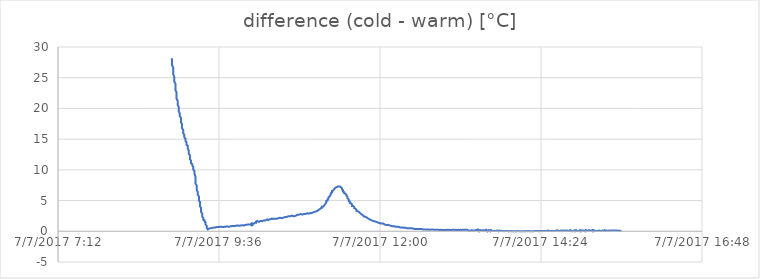
| Category | difference (cold - warm) [°C] |
|---|---|
| 42923.37013888889 | 28.06 |
| 42923.370833333334 | 28 |
| 42923.370833333334 | 27.75 |
| 42923.370833333334 | 27.37 |
| 42923.370833333334 | 27 |
| 42923.37152777778 | 26.69 |
| 42923.37152777778 | 26.31 |
| 42923.37152777778 | 25.94 |
| 42923.37152777778 | 25.56 |
| 42923.37222222222 | 25.19 |
| 42923.37222222222 | 24.81 |
| 42923.37222222222 | 24.37 |
| 42923.37291666667 | 24.06 |
| 42923.37291666667 | 23.69 |
| 42923.37291666667 | 23.38 |
| 42923.37291666667 | 23 |
| 42923.373611111114 | 22.62 |
| 42923.373611111114 | 22.31 |
| 42923.373611111114 | 21.94 |
| 42923.373611111114 | 21.62 |
| 42923.37430555555 | 21.25 |
| 42923.37430555555 | 21 |
| 42923.37430555555 | 20.75 |
| 42923.37430555555 | 20.56 |
| 42923.375 | 20.25 |
| 42923.375 | 19.87 |
| 42923.375 | 19.75 |
| 42923.375 | 19.5 |
| 42923.37569444445 | 19.19 |
| 42923.37569444445 | 18.94 |
| 42923.37569444445 | 18.75 |
| 42923.376388888886 | 18.44 |
| 42923.376388888886 | 18.12 |
| 42923.376388888886 | 17.87 |
| 42923.376388888886 | 17.69 |
| 42923.37708333333 | 17.44 |
| 42923.37708333333 | 17.19 |
| 42923.37708333333 | 16.94 |
| 42923.37708333333 | 16.75 |
| 42923.37777777778 | 16.5 |
| 42923.37777777778 | 16.25 |
| 42923.37777777778 | 16.12 |
| 42923.37777777778 | 15.94 |
| 42923.37847222222 | 15.75 |
| 42923.37847222222 | 15.56 |
| 42923.37847222222 | 15.31 |
| 42923.37847222222 | 15.25 |
| 42923.379166666666 | 15.06 |
| 42923.379166666666 | 14.94 |
| 42923.379166666666 | 14.75 |
| 42923.379166666666 | 14.63 |
| 42923.37986111111 | 14.44 |
| 42923.37986111111 | 14.25 |
| 42923.37986111111 | 14.06 |
| 42923.38055555556 | 13.94 |
| 42923.38055555556 | 13.69 |
| 42923.38055555556 | 13.5 |
| 42923.38055555556 | 13.38 |
| 42923.38125 | 13.13 |
| 42923.38125 | 12.94 |
| 42923.38125 | 12.81 |
| 42923.38125 | 12.56 |
| 42923.381944444445 | 12.37 |
| 42923.381944444445 | 12.13 |
| 42923.381944444445 | 11.94 |
| 42923.381944444445 | 11.69 |
| 42923.38263888889 | 11.5 |
| 42923.38263888889 | 11.38 |
| 42923.38263888889 | 11.25 |
| 42923.38263888889 | 11.06 |
| 42923.38333333333 | 10.94 |
| 42923.38333333333 | 10.88 |
| 42923.38333333333 | 10.75 |
| 42923.38333333333 | 10.69 |
| 42923.38402777778 | 10.5 |
| 42923.38402777778 | 10.25 |
| 42923.38402777778 | 10.06 |
| 42923.38402777778 | 9.94 |
| 42923.384722222225 | 9.81 |
| 42923.384722222225 | 9.63 |
| 42923.384722222225 | 9.44 |
| 42923.384722222225 | 9.31 |
| 42923.385416666664 | 8.81 |
| 42923.385416666664 | 8.31 |
| 42923.385416666664 | 8 |
| 42923.385416666664 | 7.75 |
| 42923.38611111111 | 7.44 |
| 42923.38611111111 | 7.19 |
| 42923.38611111111 | 6.94 |
| 42923.38611111111 | 6.69 |
| 42923.38680555556 | 6.44 |
| 42923.38680555556 | 6.19 |
| 42923.38680555556 | 5.94 |
| 42923.3875 | 5.69 |
| 42923.3875 | 5.5 |
| 42923.3875 | 5.25 |
| 42923.3875 | 5 |
| 42923.388194444444 | 4.75 |
| 42923.388194444444 | 4.5 |
| 42923.388194444444 | 4.31 |
| 42923.388194444444 | 4.06 |
| 42923.38888888889 | 3.81 |
| 42923.38888888889 | 3.62 |
| 42923.38888888889 | 3.37 |
| 42923.38888888889 | 3.12 |
| 42923.38958333333 | 2.94 |
| 42923.38958333333 | 2.69 |
| 42923.38958333333 | 2.56 |
| 42923.38958333333 | 2.37 |
| 42923.39027777778 | 2.19 |
| 42923.39027777778 | 2.06 |
| 42923.39027777778 | 2.06 |
| 42923.39027777778 | 1.87 |
| 42923.39097222222 | 1.81 |
| 42923.39097222222 | 1.62 |
| 42923.39097222222 | 1.5 |
| 42923.39166666667 | 1.44 |
| 42923.39166666667 | 1.31 |
| 42923.39166666667 | 1.12 |
| 42923.39166666667 | 1 |
| 42923.39236111111 | 0.88 |
| 42923.39236111111 | 0.75 |
| 42923.39236111111 | 0.56 |
| 42923.39236111111 | 0.44 |
| 42923.393055555556 | 0.31 |
| 42923.393055555556 | 0.19 |
| 42923.393055555556 | 0.19 |
| 42923.393055555556 | 0.25 |
| 42923.39375 | 0.44 |
| 42923.39375 | 0.5 |
| 42923.39375 | 0.44 |
| 42923.39375 | 0.5 |
| 42923.39444444444 | 0.5 |
| 42923.39444444444 | 0.5 |
| 42923.39444444444 | 0.5 |
| 42923.39444444444 | 0.5 |
| 42923.39513888889 | 0.5 |
| 42923.39513888889 | 0.56 |
| 42923.39513888889 | 0.62 |
| 42923.39513888889 | 0.62 |
| 42923.395833333336 | 0.56 |
| 42923.395833333336 | 0.62 |
| 42923.395833333336 | 0.56 |
| 42923.396527777775 | 0.56 |
| 42923.396527777775 | 0.56 |
| 42923.396527777775 | 0.62 |
| 42923.396527777775 | 0.62 |
| 42923.39722222222 | 0.62 |
| 42923.39722222222 | 0.62 |
| 42923.39722222222 | 0.62 |
| 42923.39722222222 | 0.62 |
| 42923.39791666667 | 0.62 |
| 42923.39791666667 | 0.62 |
| 42923.39791666667 | 0.62 |
| 42923.39791666667 | 0.69 |
| 42923.39861111111 | 0.69 |
| 42923.39861111111 | 0.69 |
| 42923.39861111111 | 0.69 |
| 42923.39861111111 | 0.69 |
| 42923.399305555555 | 0.69 |
| 42923.399305555555 | 0.69 |
| 42923.399305555555 | 0.69 |
| 42923.399305555555 | 0.69 |
| 42923.4 | 0.69 |
| 42923.4 | 0.69 |
| 42923.4 | 0.75 |
| 42923.4 | 0.69 |
| 42923.40069444444 | 0.75 |
| 42923.40069444444 | 0.75 |
| 42923.40069444444 | 0.75 |
| 42923.40069444444 | 0.75 |
| 42923.40138888889 | 0.75 |
| 42923.40138888889 | 0.75 |
| 42923.40138888889 | 0.75 |
| 42923.402083333334 | 0.69 |
| 42923.402083333334 | 0.69 |
| 42923.402083333334 | 0.69 |
| 42923.402083333334 | 0.69 |
| 42923.40277777778 | 0.69 |
| 42923.40277777778 | 0.75 |
| 42923.40277777778 | 0.75 |
| 42923.40277777778 | 0.75 |
| 42923.40347222222 | 0.75 |
| 42923.40347222222 | 0.75 |
| 42923.40347222222 | 0.75 |
| 42923.40347222222 | 0.75 |
| 42923.40416666667 | 0.75 |
| 42923.40416666667 | 0.75 |
| 42923.40416666667 | 0.69 |
| 42923.40416666667 | 0.75 |
| 42923.404861111114 | 0.81 |
| 42923.404861111114 | 0.75 |
| 42923.404861111114 | 0.75 |
| 42923.404861111114 | 0.75 |
| 42923.40555555555 | 0.75 |
| 42923.40555555555 | 0.81 |
| 42923.40555555555 | 0.81 |
| 42923.40625 | 0.75 |
| 42923.40625 | 0.75 |
| 42923.40625 | 0.81 |
| 42923.40625 | 0.81 |
| 42923.40694444445 | 0.81 |
| 42923.40694444445 | 0.81 |
| 42923.40694444445 | 0.81 |
| 42923.40694444445 | 0.81 |
| 42923.407638888886 | 0.81 |
| 42923.407638888886 | 0.88 |
| 42923.407638888886 | 0.88 |
| 42923.407638888886 | 0.88 |
| 42923.40833333333 | 0.88 |
| 42923.40833333333 | 0.81 |
| 42923.40833333333 | 0.88 |
| 42923.40833333333 | 0.88 |
| 42923.40902777778 | 0.88 |
| 42923.40902777778 | 0.81 |
| 42923.40902777778 | 0.88 |
| 42923.40902777778 | 0.88 |
| 42923.40972222222 | 0.88 |
| 42923.40972222222 | 0.88 |
| 42923.40972222222 | 0.88 |
| 42923.410416666666 | 0.88 |
| 42923.410416666666 | 0.88 |
| 42923.410416666666 | 0.88 |
| 42923.410416666666 | 0.94 |
| 42923.41111111111 | 0.94 |
| 42923.41111111111 | 0.94 |
| 42923.41111111111 | 0.94 |
| 42923.41180555556 | 0.94 |
| 42923.41180555556 | 0.88 |
| 42923.41180555556 | 0.88 |
| 42923.41180555556 | 0.88 |
| 42923.4125 | 0.88 |
| 42923.4125 | 0.94 |
| 42923.4125 | 0.94 |
| 42923.4125 | 1 |
| 42923.413194444445 | 0.94 |
| 42923.413194444445 | 0.94 |
| 42923.413194444445 | 0.94 |
| 42923.413194444445 | 0.94 |
| 42923.41388888889 | 0.94 |
| 42923.41388888889 | 1 |
| 42923.41388888889 | 1 |
| 42923.41388888889 | 1 |
| 42923.41458333333 | 1 |
| 42923.41458333333 | 0.94 |
| 42923.41458333333 | 0.94 |
| 42923.41458333333 | 1 |
| 42923.41527777778 | 0.94 |
| 42923.41527777778 | 1 |
| 42923.41527777778 | 1.06 |
| 42923.41527777778 | 1 |
| 42923.415972222225 | 1 |
| 42923.415972222225 | 1 |
| 42923.415972222225 | 1.06 |
| 42923.415972222225 | 1.06 |
| 42923.416666666664 | 1.06 |
| 42923.416666666664 | 1.06 |
| 42923.416666666664 | 1.06 |
| 42923.41736111111 | 1.06 |
| 42923.41736111111 | 1.06 |
| 42923.41736111111 | 1.12 |
| 42923.41736111111 | 1.06 |
| 42923.41805555556 | 1.12 |
| 42923.41805555556 | 1.06 |
| 42923.41805555556 | 1.12 |
| 42923.41805555556 | 1.12 |
| 42923.41875 | 1.12 |
| 42923.41875 | 1.12 |
| 42923.41875 | 1.19 |
| 42923.41875 | 1.12 |
| 42923.419444444444 | 1.12 |
| 42923.419444444444 | 1.19 |
| 42923.419444444444 | 1.19 |
| 42923.419444444444 | 1.19 |
| 42923.42013888889 | 1.25 |
| 42923.42013888889 | 1.25 |
| 42923.42013888889 | 1 |
| 42923.42083333333 | 1 |
| 42923.42083333333 | 1.06 |
| 42923.42083333333 | 1.12 |
| 42923.42083333333 | 1.19 |
| 42923.42152777778 | 1.25 |
| 42923.42152777778 | 1.25 |
| 42923.42152777778 | 1.31 |
| 42923.42152777778 | 1.31 |
| 42923.42222222222 | 1.37 |
| 42923.42222222222 | 1.37 |
| 42923.42222222222 | 1.37 |
| 42923.42222222222 | 1.37 |
| 42923.42291666667 | 1.37 |
| 42923.42291666667 | 1.37 |
| 42923.42291666667 | 1.37 |
| 42923.42291666667 | 1.56 |
| 42923.42361111111 | 1.69 |
| 42923.42361111111 | 1.62 |
| 42923.42361111111 | 1.69 |
| 42923.42361111111 | 1.62 |
| 42923.424305555556 | 1.56 |
| 42923.424305555556 | 1.56 |
| 42923.424305555556 | 1.56 |
| 42923.424305555556 | 1.56 |
| 42923.425 | 1.56 |
| 42923.425 | 1.62 |
| 42923.425 | 1.62 |
| 42923.425 | 1.62 |
| 42923.42569444444 | 1.69 |
| 42923.42569444444 | 1.69 |
| 42923.42569444444 | 1.69 |
| 42923.42569444444 | 1.69 |
| 42923.42638888889 | 1.69 |
| 42923.42638888889 | 1.69 |
| 42923.42638888889 | 1.69 |
| 42923.42638888889 | 1.69 |
| 42923.427083333336 | 1.69 |
| 42923.427083333336 | 1.69 |
| 42923.427083333336 | 1.69 |
| 42923.427083333336 | 1.69 |
| 42923.427777777775 | 1.75 |
| 42923.427777777775 | 1.75 |
| 42923.427777777775 | 1.81 |
| 42923.42847222222 | 1.75 |
| 42923.42847222222 | 1.75 |
| 42923.42847222222 | 1.75 |
| 42923.42847222222 | 1.81 |
| 42923.42916666667 | 1.81 |
| 42923.42916666667 | 1.81 |
| 42923.42916666667 | 1.87 |
| 42923.42916666667 | 1.87 |
| 42923.42986111111 | 1.94 |
| 42923.42986111111 | 1.87 |
| 42923.42986111111 | 1.87 |
| 42923.42986111111 | 1.94 |
| 42923.430555555555 | 1.81 |
| 42923.430555555555 | 1.87 |
| 42923.430555555555 | 1.87 |
| 42923.430555555555 | 1.94 |
| 42923.43125 | 1.94 |
| 42923.43125 | 1.94 |
| 42923.43125 | 1.94 |
| 42923.43125 | 2 |
| 42923.43194444444 | 1.94 |
| 42923.43194444444 | 1.94 |
| 42923.43194444444 | 1.94 |
| 42923.43194444444 | 2 |
| 42923.43263888889 | 2.06 |
| 42923.43263888889 | 2.06 |
| 42923.43263888889 | 2 |
| 42923.43263888889 | 2.06 |
| 42923.433333333334 | 2 |
| 42923.433333333334 | 2 |
| 42923.433333333334 | 2.06 |
| 42923.43402777778 | 2.06 |
| 42923.43402777778 | 2 |
| 42923.43402777778 | 2.06 |
| 42923.43402777778 | 2.06 |
| 42923.43472222222 | 2.06 |
| 42923.43472222222 | 2.12 |
| 42923.43472222222 | 2.06 |
| 42923.43472222222 | 2.06 |
| 42923.43541666667 | 2.06 |
| 42923.43541666667 | 2.12 |
| 42923.43541666667 | 2.06 |
| 42923.43541666667 | 2.12 |
| 42923.436111111114 | 2.06 |
| 42923.436111111114 | 2.12 |
| 42923.436111111114 | 2.12 |
| 42923.436111111114 | 2.12 |
| 42923.43680555555 | 2.12 |
| 42923.43680555555 | 2.19 |
| 42923.43680555555 | 2.12 |
| 42923.43680555555 | 2.19 |
| 42923.4375 | 2.19 |
| 42923.4375 | 2.12 |
| 42923.4375 | 2.19 |
| 42923.4375 | 2.12 |
| 42923.43819444445 | 2.19 |
| 42923.43819444445 | 2.19 |
| 42923.43819444445 | 2.25 |
| 42923.43819444445 | 2.12 |
| 42923.438888888886 | 2.12 |
| 42923.438888888886 | 2.06 |
| 42923.438888888886 | 2.12 |
| 42923.43958333333 | 2.19 |
| 42923.43958333333 | 2.25 |
| 42923.43958333333 | 2.25 |
| 42923.43958333333 | 2.25 |
| 42923.44027777778 | 2.25 |
| 42923.44027777778 | 2.25 |
| 42923.44027777778 | 2.25 |
| 42923.44027777778 | 2.25 |
| 42923.44097222222 | 2.31 |
| 42923.44097222222 | 2.31 |
| 42923.44097222222 | 2.31 |
| 42923.44097222222 | 2.31 |
| 42923.441666666666 | 2.31 |
| 42923.441666666666 | 2.37 |
| 42923.441666666666 | 2.37 |
| 42923.441666666666 | 2.37 |
| 42923.44236111111 | 2.37 |
| 42923.44236111111 | 2.44 |
| 42923.44236111111 | 2.44 |
| 42923.44236111111 | 2.44 |
| 42923.44305555556 | 2.44 |
| 42923.44305555556 | 2.44 |
| 42923.44305555556 | 2.44 |
| 42923.44375 | 2.44 |
| 42923.44375 | 2.5 |
| 42923.44375 | 2.44 |
| 42923.44375 | 2.5 |
| 42923.444444444445 | 2.44 |
| 42923.444444444445 | 2.5 |
| 42923.444444444445 | 2.5 |
| 42923.444444444445 | 2.5 |
| 42923.44513888889 | 2.56 |
| 42923.44513888889 | 2.62 |
| 42923.44513888889 | 2.62 |
| 42923.44513888889 | 2.56 |
| 42923.44583333333 | 2.5 |
| 42923.44583333333 | 2.5 |
| 42923.44583333333 | 2.56 |
| 42923.44583333333 | 2.44 |
| 42923.44652777778 | 2.44 |
| 42923.44652777778 | 2.44 |
| 42923.44652777778 | 2.5 |
| 42923.44652777778 | 2.44 |
| 42923.447222222225 | 2.5 |
| 42923.447222222225 | 2.5 |
| 42923.447222222225 | 2.56 |
| 42923.447916666664 | 2.56 |
| 42923.447916666664 | 2.56 |
| 42923.447916666664 | 2.56 |
| 42923.447916666664 | 2.62 |
| 42923.44861111111 | 2.69 |
| 42923.44861111111 | 2.62 |
| 42923.44861111111 | 2.69 |
| 42923.44861111111 | 2.69 |
| 42923.44930555556 | 2.69 |
| 42923.44930555556 | 2.69 |
| 42923.44930555556 | 2.69 |
| 42923.44930555556 | 2.69 |
| 42923.45 | 2.75 |
| 42923.45 | 2.81 |
| 42923.45 | 2.75 |
| 42923.45 | 2.75 |
| 42923.450694444444 | 2.81 |
| 42923.450694444444 | 2.75 |
| 42923.450694444444 | 2.75 |
| 42923.450694444444 | 2.81 |
| 42923.45138888889 | 2.75 |
| 42923.45138888889 | 2.81 |
| 42923.45138888889 | 2.75 |
| 42923.45138888889 | 2.75 |
| 42923.45208333333 | 2.75 |
| 42923.45208333333 | 2.69 |
| 42923.45208333333 | 2.75 |
| 42923.45208333333 | 2.75 |
| 42923.45277777778 | 2.81 |
| 42923.45277777778 | 2.75 |
| 42923.45277777778 | 2.81 |
| 42923.45347222222 | 2.81 |
| 42923.45347222222 | 2.87 |
| 42923.45347222222 | 2.87 |
| 42923.45347222222 | 2.81 |
| 42923.45416666667 | 2.87 |
| 42923.45416666667 | 2.87 |
| 42923.45416666667 | 2.87 |
| 42923.45416666667 | 2.87 |
| 42923.45486111111 | 2.94 |
| 42923.45486111111 | 2.87 |
| 42923.45486111111 | 2.87 |
| 42923.45486111111 | 2.87 |
| 42923.455555555556 | 2.87 |
| 42923.455555555556 | 2.87 |
| 42923.455555555556 | 2.87 |
| 42923.455555555556 | 2.94 |
| 42923.45625 | 2.94 |
| 42923.45625 | 3 |
| 42923.45625 | 2.94 |
| 42923.45625 | 2.94 |
| 42923.45694444444 | 2.94 |
| 42923.45694444444 | 3 |
| 42923.45694444444 | 3.06 |
| 42923.45694444444 | 3.06 |
| 42923.45763888889 | 3 |
| 42923.45763888889 | 3.06 |
| 42923.45763888889 | 3.06 |
| 42923.45763888889 | 3.06 |
| 42923.458333333336 | 3.06 |
| 42923.458333333336 | 3.06 |
| 42923.458333333336 | 3.06 |
| 42923.458333333336 | 3.06 |
| 42923.459027777775 | 3.12 |
| 42923.459027777775 | 3.12 |
| 42923.459027777775 | 3.12 |
| 42923.459027777775 | 3.19 |
| 42923.45972222222 | 3.19 |
| 42923.45972222222 | 3.19 |
| 42923.45972222222 | 3.25 |
| 42923.46041666667 | 3.25 |
| 42923.46041666667 | 3.25 |
| 42923.46041666667 | 3.25 |
| 42923.46041666667 | 3.31 |
| 42923.46111111111 | 3.31 |
| 42923.46111111111 | 3.31 |
| 42923.46111111111 | 3.37 |
| 42923.46111111111 | 3.44 |
| 42923.461805555555 | 3.5 |
| 42923.461805555555 | 3.5 |
| 42923.461805555555 | 3.5 |
| 42923.461805555555 | 3.56 |
| 42923.4625 | 3.56 |
| 42923.4625 | 3.62 |
| 42923.4625 | 3.69 |
| 42923.4625 | 3.69 |
| 42923.46319444444 | 3.75 |
| 42923.46319444444 | 3.75 |
| 42923.46319444444 | 3.81 |
| 42923.46319444444 | 3.81 |
| 42923.46388888889 | 3.81 |
| 42923.46388888889 | 3.94 |
| 42923.46388888889 | 3.94 |
| 42923.46388888889 | 4 |
| 42923.464583333334 | 4 |
| 42923.464583333334 | 4.06 |
| 42923.464583333334 | 4.12 |
| 42923.46527777778 | 4.19 |
| 42923.46527777778 | 4.19 |
| 42923.46527777778 | 4.31 |
| 42923.46527777778 | 4.31 |
| 42923.46597222222 | 4.44 |
| 42923.46597222222 | 4.44 |
| 42923.46597222222 | 4.56 |
| 42923.46597222222 | 4.56 |
| 42923.46666666667 | 4.69 |
| 42923.46666666667 | 4.75 |
| 42923.46666666667 | 4.81 |
| 42923.46666666667 | 4.94 |
| 42923.467361111114 | 5 |
| 42923.467361111114 | 5.12 |
| 42923.467361111114 | 5.19 |
| 42923.467361111114 | 5.25 |
| 42923.46805555555 | 5.31 |
| 42923.46805555555 | 5.44 |
| 42923.46805555555 | 5.56 |
| 42923.46805555555 | 5.56 |
| 42923.46875 | 5.69 |
| 42923.46875 | 5.75 |
| 42923.46875 | 5.81 |
| 42923.46944444445 | 6 |
| 42923.46944444445 | 6.12 |
| 42923.46944444445 | 6.19 |
| 42923.46944444445 | 6.19 |
| 42923.470138888886 | 6.31 |
| 42923.470138888886 | 6.37 |
| 42923.470138888886 | 6.37 |
| 42923.470138888886 | 6.56 |
| 42923.47083333333 | 6.62 |
| 42923.47083333333 | 6.62 |
| 42923.47083333333 | 6.75 |
| 42923.47083333333 | 6.75 |
| 42923.47152777778 | 6.87 |
| 42923.47152777778 | 6.87 |
| 42923.47152777778 | 6.94 |
| 42923.47152777778 | 7 |
| 42923.47222222222 | 7.06 |
| 42923.47222222222 | 7.06 |
| 42923.47222222222 | 7.12 |
| 42923.47222222222 | 7.12 |
| 42923.472916666666 | 7.19 |
| 42923.472916666666 | 7.19 |
| 42923.472916666666 | 7.19 |
| 42923.472916666666 | 7.25 |
| 42923.47361111111 | 7.25 |
| 42923.47361111111 | 7.31 |
| 42923.47361111111 | 7.25 |
| 42923.47361111111 | 7.31 |
| 42923.47430555556 | 7.31 |
| 42923.47430555556 | 7.37 |
| 42923.47430555556 | 7.31 |
| 42923.475 | 7.31 |
| 42923.475 | 7.31 |
| 42923.475 | 7.25 |
| 42923.475 | 7.25 |
| 42923.475694444445 | 7.19 |
| 42923.475694444445 | 7.19 |
| 42923.475694444445 | 7.19 |
| 42923.475694444445 | 7.06 |
| 42923.47638888889 | 7 |
| 42923.47638888889 | 6.94 |
| 42923.47638888889 | 6.87 |
| 42923.47638888889 | 6.81 |
| 42923.47708333333 | 6.69 |
| 42923.47708333333 | 6.69 |
| 42923.47708333333 | 6.56 |
| 42923.47708333333 | 6.44 |
| 42923.47777777778 | 6.37 |
| 42923.47777777778 | 6.31 |
| 42923.47777777778 | 6.25 |
| 42923.47777777778 | 6.19 |
| 42923.478472222225 | 6.12 |
| 42923.478472222225 | 6 |
| 42923.478472222225 | 6 |
| 42923.479166666664 | 5.94 |
| 42923.479166666664 | 5.75 |
| 42923.479166666664 | 5.69 |
| 42923.479166666664 | 5.62 |
| 42923.47986111111 | 5.56 |
| 42923.47986111111 | 5.44 |
| 42923.47986111111 | 5.37 |
| 42923.47986111111 | 5.31 |
| 42923.48055555556 | 5.19 |
| 42923.48055555556 | 5.12 |
| 42923.48055555556 | 5.06 |
| 42923.48055555556 | 4.94 |
| 42923.48125 | 4.87 |
| 42923.48125 | 4.81 |
| 42923.48125 | 4.75 |
| 42923.48125 | 4.62 |
| 42923.481944444444 | 4.56 |
| 42923.481944444444 | 4.5 |
| 42923.481944444444 | 4.5 |
| 42923.48263888889 | 4.37 |
| 42923.48263888889 | 4.25 |
| 42923.48263888889 | 4.25 |
| 42923.48263888889 | 4.12 |
| 42923.48333333333 | 4.12 |
| 42923.48333333333 | 4.06 |
| 42923.48333333333 | 4 |
| 42923.48333333333 | 4 |
| 42923.48402777778 | 3.94 |
| 42923.48402777778 | 3.87 |
| 42923.48402777778 | 3.75 |
| 42923.48402777778 | 3.69 |
| 42923.48472222222 | 3.69 |
| 42923.48472222222 | 3.62 |
| 42923.48472222222 | 3.56 |
| 42923.48472222222 | 3.56 |
| 42923.48541666667 | 3.5 |
| 42923.48541666667 | 3.44 |
| 42923.48541666667 | 3.37 |
| 42923.48541666667 | 3.31 |
| 42923.48611111111 | 3.25 |
| 42923.48611111111 | 3.25 |
| 42923.48611111111 | 3.19 |
| 42923.486805555556 | 3.19 |
| 42923.486805555556 | 3.12 |
| 42923.486805555556 | 3.06 |
| 42923.486805555556 | 3.06 |
| 42923.4875 | 3 |
| 42923.4875 | 2.94 |
| 42923.4875 | 2.87 |
| 42923.4875 | 2.87 |
| 42923.48819444444 | 2.81 |
| 42923.48819444444 | 2.81 |
| 42923.48819444444 | 2.81 |
| 42923.48819444444 | 2.75 |
| 42923.48888888889 | 2.69 |
| 42923.48888888889 | 2.62 |
| 42923.48888888889 | 2.69 |
| 42923.48888888889 | 2.62 |
| 42923.489583333336 | 2.56 |
| 42923.489583333336 | 2.5 |
| 42923.489583333336 | 2.5 |
| 42923.489583333336 | 2.5 |
| 42923.490277777775 | 2.37 |
| 42923.490277777775 | 2.44 |
| 42923.490277777775 | 2.37 |
| 42923.49097222222 | 2.37 |
| 42923.49097222222 | 2.31 |
| 42923.49097222222 | 2.25 |
| 42923.49097222222 | 2.31 |
| 42923.49166666667 | 2.25 |
| 42923.49166666667 | 2.25 |
| 42923.49166666667 | 2.19 |
| 42923.49166666667 | 2.19 |
| 42923.49236111111 | 2.12 |
| 42923.49236111111 | 2.12 |
| 42923.49236111111 | 2.06 |
| 42923.49236111111 | 2.06 |
| 42923.493055555555 | 2 |
| 42923.493055555555 | 2 |
| 42923.493055555555 | 2.06 |
| 42923.493055555555 | 1.94 |
| 42923.49375 | 1.94 |
| 42923.49375 | 1.87 |
| 42923.49375 | 1.94 |
| 42923.49375 | 1.81 |
| 42923.49444444444 | 1.81 |
| 42923.49444444444 | 1.87 |
| 42923.49444444444 | 1.81 |
| 42923.49513888889 | 1.75 |
| 42923.49513888889 | 1.75 |
| 42923.49513888889 | 1.75 |
| 42923.49513888889 | 1.69 |
| 42923.495833333334 | 1.69 |
| 42923.495833333334 | 1.69 |
| 42923.495833333334 | 1.69 |
| 42923.495833333334 | 1.62 |
| 42923.49652777778 | 1.62 |
| 42923.49652777778 | 1.62 |
| 42923.49652777778 | 1.62 |
| 42923.49652777778 | 1.56 |
| 42923.49722222222 | 1.56 |
| 42923.49722222222 | 1.56 |
| 42923.49722222222 | 1.56 |
| 42923.49722222222 | 1.56 |
| 42923.49791666667 | 1.5 |
| 42923.49791666667 | 1.5 |
| 42923.49791666667 | 1.44 |
| 42923.49791666667 | 1.44 |
| 42923.498611111114 | 1.44 |
| 42923.498611111114 | 1.44 |
| 42923.498611111114 | 1.44 |
| 42923.49930555555 | 1.37 |
| 42923.49930555555 | 1.37 |
| 42923.49930555555 | 1.37 |
| 42923.49930555555 | 1.37 |
| 42923.5 | 1.31 |
| 42923.5 | 1.31 |
| 42923.5 | 1.31 |
| 42923.5 | 1.31 |
| 42923.50069444445 | 1.25 |
| 42923.50069444445 | 1.25 |
| 42923.50069444445 | 1.25 |
| 42923.50069444445 | 1.25 |
| 42923.501388888886 | 1.25 |
| 42923.501388888886 | 1.25 |
| 42923.501388888886 | 1.25 |
| 42923.501388888886 | 1.19 |
| 42923.50208333333 | 1.25 |
| 42923.50208333333 | 1.19 |
| 42923.50208333333 | 1.12 |
| 42923.50208333333 | 1.12 |
| 42923.50277777778 | 1.12 |
| 42923.50277777778 | 1.12 |
| 42923.50277777778 | 1.12 |
| 42923.50277777778 | 1.06 |
| 42923.50347222222 | 1.06 |
| 42923.50347222222 | 1.06 |
| 42923.50347222222 | 1.06 |
| 42923.504166666666 | 1 |
| 42923.504166666666 | 1 |
| 42923.504166666666 | 1.06 |
| 42923.504166666666 | 1 |
| 42923.50486111111 | 1.06 |
| 42923.50486111111 | 1 |
| 42923.50486111111 | 1 |
| 42923.50486111111 | 1 |
| 42923.50555555556 | 1 |
| 42923.50555555556 | 1 |
| 42923.50555555556 | 1 |
| 42923.50555555556 | 0.94 |
| 42923.50625 | 0.94 |
| 42923.50625 | 0.94 |
| 42923.50625 | 0.94 |
| 42923.50625 | 0.88 |
| 42923.506944444445 | 0.88 |
| 42923.506944444445 | 0.88 |
| 42923.506944444445 | 0.88 |
| 42923.506944444445 | 0.88 |
| 42923.50763888889 | 0.81 |
| 42923.50763888889 | 0.88 |
| 42923.50763888889 | 0.88 |
| 42923.50763888889 | 0.88 |
| 42923.50833333333 | 0.81 |
| 42923.50833333333 | 0.81 |
| 42923.50833333333 | 0.81 |
| 42923.50833333333 | 0.81 |
| 42923.50902777778 | 0.81 |
| 42923.50902777778 | 0.81 |
| 42923.50902777778 | 0.75 |
| 42923.509722222225 | 0.75 |
| 42923.509722222225 | 0.75 |
| 42923.509722222225 | 0.75 |
| 42923.509722222225 | 0.75 |
| 42923.510416666664 | 0.75 |
| 42923.510416666664 | 0.75 |
| 42923.510416666664 | 0.69 |
| 42923.510416666664 | 0.69 |
| 42923.51111111111 | 0.75 |
| 42923.51111111111 | 0.75 |
| 42923.51111111111 | 0.75 |
| 42923.51111111111 | 0.69 |
| 42923.51180555556 | 0.69 |
| 42923.51180555556 | 0.62 |
| 42923.51180555556 | 0.62 |
| 42923.51180555556 | 0.62 |
| 42923.5125 | 0.62 |
| 42923.5125 | 0.69 |
| 42923.5125 | 0.62 |
| 42923.5125 | 0.62 |
| 42923.513194444444 | 0.62 |
| 42923.513194444444 | 0.62 |
| 42923.513194444444 | 0.62 |
| 42923.51388888889 | 0.62 |
| 42923.51388888889 | 0.62 |
| 42923.51388888889 | 0.62 |
| 42923.51388888889 | 0.56 |
| 42923.51458333333 | 0.56 |
| 42923.51458333333 | 0.62 |
| 42923.51458333333 | 0.62 |
| 42923.51458333333 | 0.56 |
| 42923.51527777778 | 0.56 |
| 42923.51527777778 | 0.56 |
| 42923.51527777778 | 0.56 |
| 42923.51527777778 | 0.5 |
| 42923.51597222222 | 0.56 |
| 42923.51597222222 | 0.56 |
| 42923.51597222222 | 0.5 |
| 42923.51597222222 | 0.5 |
| 42923.51666666667 | 0.5 |
| 42923.51666666667 | 0.56 |
| 42923.51666666667 | 0.5 |
| 42923.51666666667 | 0.5 |
| 42923.51736111111 | 0.5 |
| 42923.51736111111 | 0.5 |
| 42923.51736111111 | 0.5 |
| 42923.518055555556 | 0.5 |
| 42923.518055555556 | 0.5 |
| 42923.518055555556 | 0.5 |
| 42923.518055555556 | 0.5 |
| 42923.51875 | 0.5 |
| 42923.51875 | 0.5 |
| 42923.51875 | 0.5 |
| 42923.51875 | 0.44 |
| 42923.51944444444 | 0.5 |
| 42923.51944444444 | 0.5 |
| 42923.51944444444 | 0.5 |
| 42923.51944444444 | 0.44 |
| 42923.52013888889 | 0.44 |
| 42923.52013888889 | 0.44 |
| 42923.52013888889 | 0.44 |
| 42923.52013888889 | 0.5 |
| 42923.520833333336 | 0.44 |
| 42923.520833333336 | 0.44 |
| 42923.520833333336 | 0.44 |
| 42923.520833333336 | 0.37 |
| 42923.521527777775 | 0.37 |
| 42923.521527777775 | 0.37 |
| 42923.521527777775 | 0.44 |
| 42923.521527777775 | 0.44 |
| 42923.52222222222 | 0.37 |
| 42923.52222222222 | 0.44 |
| 42923.52222222222 | 0.44 |
| 42923.52222222222 | 0.37 |
| 42923.52291666667 | 0.37 |
| 42923.52291666667 | 0.37 |
| 42923.52291666667 | 0.37 |
| 42923.52291666667 | 0.37 |
| 42923.52361111111 | 0.37 |
| 42923.52361111111 | 0.37 |
| 42923.52361111111 | 0.37 |
| 42923.524305555555 | 0.37 |
| 42923.524305555555 | 0.37 |
| 42923.524305555555 | 0.31 |
| 42923.524305555555 | 0.37 |
| 42923.525 | 0.37 |
| 42923.525 | 0.31 |
| 42923.525 | 0.31 |
| 42923.525 | 0.31 |
| 42923.52569444444 | 0.37 |
| 42923.52569444444 | 0.37 |
| 42923.52569444444 | 0.31 |
| 42923.52569444444 | 0.31 |
| 42923.52638888889 | 0.31 |
| 42923.52638888889 | 0.31 |
| 42923.52638888889 | 0.37 |
| 42923.52638888889 | 0.31 |
| 42923.527083333334 | 0.31 |
| 42923.527083333334 | 0.31 |
| 42923.527083333334 | 0.37 |
| 42923.527083333334 | 0.31 |
| 42923.52777777778 | 0.31 |
| 42923.52777777778 | 0.31 |
| 42923.52777777778 | 0.31 |
| 42923.52777777778 | 0.37 |
| 42923.52847222222 | 0.31 |
| 42923.52847222222 | 0.31 |
| 42923.52847222222 | 0.31 |
| 42923.52847222222 | 0.31 |
| 42923.52916666667 | 0.25 |
| 42923.52916666667 | 0.31 |
| 42923.52916666667 | 0.25 |
| 42923.529861111114 | 0.31 |
| 42923.529861111114 | 0.31 |
| 42923.529861111114 | 0.31 |
| 42923.529861111114 | 0.25 |
| 42923.53055555555 | 0.25 |
| 42923.53055555555 | 0.31 |
| 42923.53055555555 | 0.31 |
| 42923.53055555555 | 0.31 |
| 42923.53125 | 0.25 |
| 42923.53125 | 0.25 |
| 42923.53125 | 0.31 |
| 42923.53125 | 0.31 |
| 42923.53194444445 | 0.31 |
| 42923.53194444445 | 0.25 |
| 42923.53194444445 | 0.25 |
| 42923.53194444445 | 0.25 |
| 42923.532638888886 | 0.31 |
| 42923.532638888886 | 0.31 |
| 42923.532638888886 | 0.25 |
| 42923.532638888886 | 0.25 |
| 42923.53333333333 | 0.25 |
| 42923.53333333333 | 0.31 |
| 42923.53333333333 | 0.25 |
| 42923.53402777778 | 0.25 |
| 42923.53402777778 | 0.25 |
| 42923.53402777778 | 0.25 |
| 42923.53402777778 | 0.25 |
| 42923.53472222222 | 0.25 |
| 42923.53472222222 | 0.19 |
| 42923.53472222222 | 0.25 |
| 42923.53472222222 | 0.25 |
| 42923.535416666666 | 0.25 |
| 42923.535416666666 | 0.25 |
| 42923.535416666666 | 0.25 |
| 42923.535416666666 | 0.25 |
| 42923.53611111111 | 0.25 |
| 42923.53611111111 | 0.25 |
| 42923.53611111111 | 0.25 |
| 42923.53611111111 | 0.25 |
| 42923.53680555556 | 0.19 |
| 42923.53680555556 | 0.25 |
| 42923.53680555556 | 0.25 |
| 42923.53680555556 | 0.25 |
| 42923.5375 | 0.25 |
| 42923.5375 | 0.25 |
| 42923.5375 | 0.25 |
| 42923.5375 | 0.19 |
| 42923.538194444445 | 0.19 |
| 42923.538194444445 | 0.31 |
| 42923.538194444445 | 0.25 |
| 42923.538194444445 | 0.19 |
| 42923.53888888889 | 0.19 |
| 42923.53888888889 | 0.19 |
| 42923.53888888889 | 0.25 |
| 42923.53958333333 | 0.19 |
| 42923.53958333333 | 0.25 |
| 42923.53958333333 | 0.25 |
| 42923.53958333333 | 0.25 |
| 42923.54027777778 | 0.19 |
| 42923.54027777778 | 0.19 |
| 42923.54027777778 | 0.25 |
| 42923.54027777778 | 0.25 |
| 42923.540972222225 | 0.19 |
| 42923.540972222225 | 0.25 |
| 42923.540972222225 | 0.19 |
| 42923.540972222225 | 0.19 |
| 42923.541666666664 | 0.25 |
| 42923.541666666664 | 0.19 |
| 42923.541666666664 | 0.25 |
| 42923.541666666664 | 0.25 |
| 42923.54236111111 | 0.19 |
| 42923.54236111111 | 0.19 |
| 42923.54236111111 | 0.19 |
| 42923.54236111111 | 0.19 |
| 42923.54305555556 | 0.25 |
| 42923.54305555556 | 0.25 |
| 42923.54305555556 | 0.31 |
| 42923.54305555556 | 0.25 |
| 42923.54375 | 0.19 |
| 42923.54375 | 0.25 |
| 42923.54375 | 0.19 |
| 42923.54375 | 0.19 |
| 42923.544444444444 | 0.19 |
| 42923.544444444444 | 0.25 |
| 42923.544444444444 | 0.25 |
| 42923.544444444444 | 0.19 |
| 42923.54513888889 | 0.25 |
| 42923.54513888889 | 0.19 |
| 42923.54513888889 | 0.25 |
| 42923.54513888889 | 0.19 |
| 42923.54583333333 | 0.25 |
| 42923.54583333333 | 0.25 |
| 42923.54583333333 | 0.19 |
| 42923.54652777778 | 0.19 |
| 42923.54652777778 | 0.19 |
| 42923.54652777778 | 0.13 |
| 42923.54652777778 | 0.19 |
| 42923.54722222222 | 0.25 |
| 42923.54722222222 | 0.13 |
| 42923.54722222222 | 0.25 |
| 42923.54722222222 | 0.19 |
| 42923.54791666667 | 0.19 |
| 42923.54791666667 | 0.25 |
| 42923.54791666667 | 0.25 |
| 42923.54791666667 | 0.25 |
| 42923.54861111111 | 0.25 |
| 42923.54861111111 | 0.25 |
| 42923.54861111111 | 0.31 |
| 42923.54861111111 | 0.19 |
| 42923.549305555556 | 0.19 |
| 42923.549305555556 | 0.25 |
| 42923.549305555556 | 0.13 |
| 42923.549305555556 | 0.19 |
| 42923.55 | 0.25 |
| 42923.55 | 0.19 |
| 42923.55 | 0.25 |
| 42923.55 | 0.19 |
| 42923.55069444444 | 0.19 |
| 42923.55069444444 | 0.19 |
| 42923.55069444444 | 0.19 |
| 42923.55069444444 | 0.19 |
| 42923.55138888889 | 0.25 |
| 42923.55138888889 | 0.25 |
| 42923.55138888889 | 0.31 |
| 42923.552083333336 | 0.25 |
| 42923.552083333336 | 0.19 |
| 42923.552083333336 | 0.19 |
| 42923.552083333336 | 0.13 |
| 42923.552777777775 | 0.25 |
| 42923.552777777775 | 0.25 |
| 42923.552777777775 | 0.25 |
| 42923.552777777775 | 0.19 |
| 42923.55347222222 | 0.25 |
| 42923.55347222222 | 0.25 |
| 42923.55347222222 | 0.25 |
| 42923.55347222222 | 0.13 |
| 42923.55416666667 | 0.25 |
| 42923.55416666667 | 0.13 |
| 42923.55416666667 | 0.25 |
| 42923.55416666667 | 0.25 |
| 42923.55486111111 | 0.13 |
| 42923.55486111111 | 0.25 |
| 42923.55486111111 | 0.13 |
| 42923.55486111111 | 0.13 |
| 42923.555555555555 | 0.13 |
| 42923.555555555555 | 0.19 |
| 42923.555555555555 | 0.19 |
| 42923.555555555555 | 0.19 |
| 42923.55625 | 0.06 |
| 42923.55625 | 0.13 |
| 42923.55625 | 0.19 |
| 42923.55694444444 | 0.19 |
| 42923.55694444444 | 0.19 |
| 42923.55694444444 | 0.13 |
| 42923.55694444444 | 0.13 |
| 42923.55763888889 | 0.13 |
| 42923.55763888889 | 0.19 |
| 42923.55763888889 | 0.13 |
| 42923.55763888889 | 0.19 |
| 42923.558333333334 | 0.13 |
| 42923.558333333334 | 0.19 |
| 42923.558333333334 | 0.19 |
| 42923.558333333334 | 0.19 |
| 42923.55902777778 | 0.13 |
| 42923.55902777778 | 0.13 |
| 42923.55902777778 | 0.06 |
| 42923.55902777778 | 0.13 |
| 42923.55972222222 | 0.19 |
| 42923.55972222222 | 0.13 |
| 42923.55972222222 | 0.13 |
| 42923.55972222222 | 0.19 |
| 42923.56041666667 | 0.19 |
| 42923.56041666667 | 0.19 |
| 42923.56041666667 | 0.06 |
| 42923.56041666667 | 0.13 |
| 42923.561111111114 | 0.06 |
| 42923.561111111114 | 0.19 |
| 42923.561111111114 | 0.25 |
| 42923.56180555555 | 0.13 |
| 42923.56180555555 | 0.19 |
| 42923.56180555555 | 0.13 |
| 42923.56180555555 | 0.13 |
| 42923.5625 | 0.19 |
| 42923.5625 | 0.13 |
| 42923.5625 | 0.06 |
| 42923.5625 | 0.19 |
| 42923.56319444445 | 0.13 |
| 42923.56319444445 | 0.06 |
| 42923.56319444445 | 0.06 |
| 42923.56319444445 | 0.06 |
| 42923.563888888886 | 0.19 |
| 42923.563888888886 | 0.06 |
| 42923.563888888886 | 0.06 |
| 42923.563888888886 | 0.06 |
| 42923.56458333333 | 0.06 |
| 42923.56458333333 | 0.19 |
| 42923.56458333333 | 0.13 |
| 42923.56458333333 | 0.13 |
| 42923.56527777778 | 0.19 |
| 42923.56527777778 | 0.06 |
| 42923.56527777778 | 0.19 |
| 42923.56527777778 | 0.06 |
| 42923.56597222222 | 0.25 |
| 42923.56597222222 | 0.13 |
| 42923.56597222222 | 0.13 |
| 42923.566666666666 | 0 |
| 42923.566666666666 | 0.13 |
| 42923.566666666666 | 0.06 |
| 42923.566666666666 | 0.06 |
| 42923.56736111111 | 0.19 |
| 42923.56736111111 | 0.13 |
| 42923.56736111111 | 0.13 |
| 42923.56736111111 | 0.19 |
| 42923.56805555556 | 0.13 |
| 42923.56805555556 | 0.19 |
| 42923.56805555556 | 0.19 |
| 42923.56805555556 | 0.13 |
| 42923.56875 | 0.19 |
| 42923.56875 | 0 |
| 42923.56875 | 0 |
| 42923.56875 | 0.13 |
| 42923.569444444445 | 0.06 |
| 42923.569444444445 | 0.13 |
| 42923.569444444445 | 0 |
| 42923.569444444445 | 0.13 |
| 42923.57013888889 | 0.06 |
| 42923.57013888889 | -0.06 |
| 42923.57013888889 | 0.06 |
| 42923.57013888889 | 0.06 |
| 42923.57083333333 | 0.06 |
| 42923.57083333333 | 0.13 |
| 42923.57083333333 | 0.06 |
| 42923.57083333333 | 0.06 |
| 42923.57152777778 | 0.06 |
| 42923.57152777778 | 0.13 |
| 42923.57152777778 | 0.06 |
| 42923.57152777778 | 0.13 |
| 42923.572222222225 | 0.06 |
| 42923.572222222225 | 0.06 |
| 42923.572222222225 | 0.19 |
| 42923.572222222225 | 0.13 |
| 42923.572916666664 | 0.13 |
| 42923.572916666664 | 0.13 |
| 42923.572916666664 | 0.06 |
| 42923.57361111111 | 0 |
| 42923.57361111111 | 0.13 |
| 42923.57361111111 | 0.13 |
| 42923.57361111111 | 0.06 |
| 42923.57430555556 | 0.13 |
| 42923.57430555556 | 0.06 |
| 42923.57430555556 | 0.13 |
| 42923.57430555556 | 0.06 |
| 42923.575 | 0.06 |
| 42923.575 | 0.13 |
| 42923.575 | 0.06 |
| 42923.575 | 0.06 |
| 42923.575694444444 | 0.06 |
| 42923.575694444444 | 0.13 |
| 42923.575694444444 | 0.06 |
| 42923.575694444444 | 0.06 |
| 42923.57638888889 | 0.06 |
| 42923.57638888889 | 0.06 |
| 42923.57638888889 | 0 |
| 42923.57638888889 | 0.06 |
| 42923.57708333333 | 0 |
| 42923.57708333333 | 0.06 |
| 42923.57708333333 | 0.06 |
| 42923.57708333333 | 0 |
| 42923.57777777778 | 0.06 |
| 42923.57777777778 | 0.06 |
| 42923.57777777778 | 0 |
| 42923.57777777778 | 0 |
| 42923.57847222222 | 0.06 |
| 42923.57847222222 | 0.06 |
| 42923.57847222222 | 0.06 |
| 42923.57916666667 | 0.06 |
| 42923.57916666667 | 0.06 |
| 42923.57916666667 | 0 |
| 42923.57916666667 | 0.06 |
| 42923.57986111111 | 0 |
| 42923.57986111111 | 0 |
| 42923.57986111111 | 0.06 |
| 42923.57986111111 | 0 |
| 42923.580555555556 | 0 |
| 42923.580555555556 | 0.06 |
| 42923.580555555556 | 0.06 |
| 42923.580555555556 | 0 |
| 42923.58125 | 0.06 |
| 42923.58125 | 0 |
| 42923.58125 | 0 |
| 42923.58125 | 0 |
| 42923.58194444444 | 0 |
| 42923.58194444444 | 0 |
| 42923.58194444444 | 0 |
| 42923.58194444444 | 0 |
| 42923.58263888889 | 0 |
| 42923.58263888889 | 0 |
| 42923.58263888889 | 0 |
| 42923.58263888889 | 0 |
| 42923.583333333336 | 0 |
| 42923.583333333336 | 0 |
| 42923.583333333336 | 0 |
| 42923.584027777775 | 0 |
| 42923.584027777775 | 0.06 |
| 42923.584027777775 | 0.06 |
| 42923.584027777775 | 0 |
| 42923.58472222222 | 0 |
| 42923.58472222222 | 0 |
| 42923.58472222222 | 0 |
| 42923.58472222222 | 0 |
| 42923.58541666667 | 0.06 |
| 42923.58541666667 | 0 |
| 42923.58541666667 | 0 |
| 42923.58541666667 | 0 |
| 42923.58611111111 | 0 |
| 42923.58611111111 | 0.06 |
| 42923.58611111111 | 0 |
| 42923.58611111111 | 0 |
| 42923.586805555555 | 0 |
| 42923.586805555555 | 0 |
| 42923.586805555555 | 0.06 |
| 42923.5875 | 0 |
| 42923.5875 | 0 |
| 42923.5875 | 0 |
| 42923.5875 | 0 |
| 42923.58819444444 | 0 |
| 42923.58819444444 | 0 |
| 42923.58819444444 | 0.06 |
| 42923.58819444444 | 0 |
| 42923.58888888889 | 0 |
| 42923.58888888889 | 0 |
| 42923.58888888889 | 0.06 |
| 42923.58888888889 | 0 |
| 42923.589583333334 | 0 |
| 42923.589583333334 | 0 |
| 42923.589583333334 | 0.06 |
| 42923.589583333334 | 0 |
| 42923.59027777778 | 0 |
| 42923.59027777778 | 0.06 |
| 42923.59027777778 | 0.06 |
| 42923.59027777778 | 0.06 |
| 42923.59097222222 | 0.06 |
| 42923.59097222222 | 0 |
| 42923.59097222222 | 0 |
| 42923.59097222222 | 0.06 |
| 42923.59166666667 | 0 |
| 42923.59166666667 | 0 |
| 42923.59166666667 | 0 |
| 42923.592361111114 | 0.06 |
| 42923.592361111114 | 0 |
| 42923.592361111114 | 0 |
| 42923.592361111114 | 0 |
| 42923.59305555555 | 0 |
| 42923.59305555555 | 0 |
| 42923.59305555555 | 0 |
| 42923.59305555555 | 0.06 |
| 42923.59375 | 0 |
| 42923.59375 | 0 |
| 42923.59375 | 0 |
| 42923.59375 | 0 |
| 42923.59444444445 | 0 |
| 42923.59444444445 | 0 |
| 42923.59444444445 | 0.06 |
| 42923.59444444445 | 0.06 |
| 42923.595138888886 | 0 |
| 42923.595138888886 | 0 |
| 42923.595138888886 | 0.06 |
| 42923.595138888886 | 0 |
| 42923.59583333333 | 0.06 |
| 42923.59583333333 | 0 |
| 42923.59583333333 | 0.06 |
| 42923.59583333333 | 0 |
| 42923.59652777778 | 0.06 |
| 42923.59652777778 | 0.06 |
| 42923.59652777778 | 0.06 |
| 42923.59722222222 | 0.06 |
| 42923.59722222222 | 0.06 |
| 42923.59722222222 | 0.06 |
| 42923.59722222222 | 0.06 |
| 42923.597916666666 | 0.06 |
| 42923.597916666666 | 0 |
| 42923.597916666666 | 0.06 |
| 42923.597916666666 | 0 |
| 42923.59861111111 | 0 |
| 42923.59861111111 | 0.06 |
| 42923.59861111111 | 0.06 |
| 42923.59861111111 | 0.06 |
| 42923.59930555556 | 0.06 |
| 42923.59930555556 | 0.06 |
| 42923.59930555556 | 0.06 |
| 42923.59930555556 | 0.06 |
| 42923.6 | 0.06 |
| 42923.6 | 0.06 |
| 42923.6 | 0 |
| 42923.6 | 0.06 |
| 42923.600694444445 | 0.06 |
| 42923.600694444445 | 0.13 |
| 42923.600694444445 | 0.06 |
| 42923.600694444445 | 0.06 |
| 42923.60138888889 | 0.06 |
| 42923.60138888889 | 0.06 |
| 42923.60138888889 | 0.06 |
| 42923.60208333333 | 0.06 |
| 42923.60208333333 | 0.06 |
| 42923.60208333333 | 0.06 |
| 42923.60208333333 | 0.06 |
| 42923.60277777778 | 0.06 |
| 42923.60277777778 | 0.06 |
| 42923.60277777778 | 0 |
| 42923.60277777778 | 0.06 |
| 42923.603472222225 | 0.06 |
| 42923.603472222225 | 0.06 |
| 42923.603472222225 | 0.06 |
| 42923.603472222225 | 0.13 |
| 42923.604166666664 | 0.13 |
| 42923.604166666664 | 0.06 |
| 42923.604166666664 | 0.06 |
| 42923.604166666664 | 0.06 |
| 42923.60486111111 | 0.06 |
| 42923.60486111111 | 0.06 |
| 42923.60486111111 | 0.06 |
| 42923.60486111111 | 0.06 |
| 42923.60555555556 | 0.06 |
| 42923.60555555556 | 0.13 |
| 42923.60555555556 | 0.06 |
| 42923.60625 | 0.06 |
| 42923.60625 | 0.06 |
| 42923.60625 | 0.06 |
| 42923.60625 | 0.06 |
| 42923.606944444444 | 0.06 |
| 42923.606944444444 | 0.13 |
| 42923.606944444444 | 0.13 |
| 42923.606944444444 | 0.06 |
| 42923.60763888889 | 0.06 |
| 42923.60763888889 | 0.06 |
| 42923.60763888889 | 0.06 |
| 42923.60763888889 | 0.13 |
| 42923.60833333333 | 0.06 |
| 42923.60833333333 | 0.13 |
| 42923.60833333333 | 0.13 |
| 42923.60833333333 | 0.06 |
| 42923.60902777778 | 0.06 |
| 42923.60902777778 | 0.06 |
| 42923.60902777778 | 0.06 |
| 42923.60902777778 | 0.06 |
| 42923.60972222222 | 0.13 |
| 42923.60972222222 | 0.13 |
| 42923.60972222222 | 0.06 |
| 42923.61041666667 | 0.13 |
| 42923.61041666667 | 0.06 |
| 42923.61041666667 | 0.13 |
| 42923.61041666667 | 0.06 |
| 42923.61111111111 | 0.06 |
| 42923.61111111111 | 0.13 |
| 42923.61111111111 | 0.06 |
| 42923.61111111111 | 0.06 |
| 42923.611805555556 | 0.06 |
| 42923.611805555556 | 0 |
| 42923.611805555556 | 0.06 |
| 42923.611805555556 | 0.13 |
| 42923.6125 | 0.13 |
| 42923.6125 | 0 |
| 42923.6125 | 0.06 |
| 42923.6125 | 0.06 |
| 42923.61319444444 | 0.06 |
| 42923.61319444444 | 0.06 |
| 42923.61319444444 | 0.06 |
| 42923.61319444444 | 0.13 |
| 42923.61388888889 | 0.13 |
| 42923.61388888889 | 0.06 |
| 42923.61388888889 | 0.13 |
| 42923.61388888889 | 0.19 |
| 42923.614583333336 | 0.06 |
| 42923.614583333336 | 0.06 |
| 42923.614583333336 | 0.13 |
| 42923.614583333336 | 0.13 |
| 42923.615277777775 | 0.13 |
| 42923.615277777775 | 0.13 |
| 42923.615277777775 | 0.06 |
| 42923.61597222222 | 0.13 |
| 42923.61597222222 | 0.06 |
| 42923.61597222222 | 0.06 |
| 42923.61597222222 | 0.13 |
| 42923.61666666667 | 0.06 |
| 42923.61666666667 | 0.13 |
| 42923.61666666667 | 0.06 |
| 42923.61666666667 | 0.19 |
| 42923.61736111111 | 0.06 |
| 42923.61736111111 | 0.13 |
| 42923.61736111111 | -0.06 |
| 42923.61736111111 | 0 |
| 42923.618055555555 | 0.19 |
| 42923.618055555555 | 0.13 |
| 42923.618055555555 | 0.06 |
| 42923.618055555555 | 0.19 |
| 42923.61875 | 0.06 |
| 42923.61875 | 0 |
| 42923.61875 | 0.13 |
| 42923.61875 | 0.06 |
| 42923.61944444444 | 0 |
| 42923.61944444444 | 0 |
| 42923.61944444444 | 0.06 |
| 42923.62013888889 | 0.06 |
| 42923.62013888889 | 0 |
| 42923.62013888889 | 0 |
| 42923.62013888889 | 0.19 |
| 42923.620833333334 | 0.13 |
| 42923.620833333334 | 0.19 |
| 42923.620833333334 | 0.13 |
| 42923.620833333334 | 0.06 |
| 42923.62152777778 | 0.19 |
| 42923.62152777778 | 0.06 |
| 42923.62152777778 | 0 |
| 42923.62152777778 | 0 |
| 42923.62222222222 | 0.06 |
| 42923.62222222222 | 0 |
| 42923.62222222222 | 0.06 |
| 42923.62222222222 | 0 |
| 42923.62291666667 | 0.06 |
| 42923.62291666667 | 0.06 |
| 42923.62291666667 | 0.06 |
| 42923.62291666667 | 0.19 |
| 42923.623611111114 | 0.06 |
| 42923.623611111114 | 0.13 |
| 42923.623611111114 | 0.19 |
| 42923.623611111114 | 0.06 |
| 42923.62430555555 | 0 |
| 42923.62430555555 | 0.19 |
| 42923.62430555555 | 0.13 |
| 42923.62430555555 | 0.13 |
| 42923.625 | 0.13 |
| 42923.625 | 0.13 |
| 42923.625 | 0.25 |
| 42923.625 | 0.06 |
| 42923.62569444445 | 0.13 |
| 42923.62569444445 | 0.13 |
| 42923.62569444445 | 0.13 |
| 42923.626388888886 | 0.13 |
| 42923.626388888886 | 0.06 |
| 42923.626388888886 | 0.06 |
| 42923.626388888886 | 0.06 |
| 42923.62708333333 | 0 |
| 42923.62708333333 | 0 |
| 42923.62708333333 | 0.13 |
| 42923.62708333333 | 0.13 |
| 42923.62777777778 | 0 |
| 42923.62777777778 | 0.06 |
| 42923.62777777778 | 0.13 |
| 42923.62777777778 | 0.19 |
| 42923.62847222222 | 0.13 |
| 42923.62847222222 | 0.13 |
| 42923.62847222222 | 0.13 |
| 42923.62847222222 | 0.19 |
| 42923.629166666666 | 0.13 |
| 42923.629166666666 | 0.13 |
| 42923.629166666666 | 0.13 |
| 42923.629166666666 | 0.13 |
| 42923.62986111111 | 0.19 |
| 42923.62986111111 | 0.13 |
| 42923.62986111111 | 0.13 |
| 42923.63055555556 | 0.13 |
| 42923.63055555556 | 0.06 |
| 42923.63055555556 | 0.19 |
| 42923.63055555556 | 0.19 |
| 42923.63125 | 0.06 |
| 42923.63125 | 0.19 |
| 42923.63125 | 0.13 |
| 42923.63125 | 0 |
| 42923.631944444445 | 0.19 |
| 42923.631944444445 | 0.19 |
| 42923.631944444445 | 0.13 |
| 42923.631944444445 | 0.13 |
| 42923.63263888889 | 0.19 |
| 42923.63263888889 | 0.06 |
| 42923.63263888889 | 0 |
| 42923.63263888889 | 0.13 |
| 42923.63333333333 | 0.06 |
| 42923.63333333333 | 0.13 |
| 42923.63333333333 | 0.06 |
| 42923.63333333333 | 0.13 |
| 42923.63402777778 | 0.06 |
| 42923.63402777778 | 0.13 |
| 42923.63402777778 | 0.13 |
| 42923.63402777778 | 0.06 |
| 42923.634722222225 | 0.06 |
| 42923.634722222225 | 0.13 |
| 42923.634722222225 | 0.19 |
| 42923.634722222225 | 0.06 |
| 42923.635416666664 | 0.06 |
| 42923.635416666664 | 0.06 |
| 42923.635416666664 | 0.13 |
| 42923.635416666664 | 0 |
| 42923.63611111111 | 0.13 |
| 42923.63611111111 | 0.06 |
| 42923.63611111111 | 0.13 |
| 42923.63611111111 | 0.06 |
| 42923.63680555556 | 0.06 |
| 42923.63680555556 | 0.06 |
| 42923.63680555556 | 0.06 |
| 42923.6375 | 0.06 |
| 42923.6375 | 0.13 |
| 42923.6375 | 0.06 |
| 42923.6375 | 0.19 |
| 42923.638194444444 | 0.13 |
| 42923.638194444444 | 0.13 |
| 42923.638194444444 | 0.13 |
| 42923.638194444444 | 0.06 |
| 42923.63888888889 | 0.06 |
| 42923.63888888889 | 0.06 |
| 42923.63888888889 | 0.06 |
| 42923.63888888889 | 0.06 |
| 42923.63958333333 | 0.19 |
| 42923.63958333333 | 0.13 |
| 42923.63958333333 | 0.13 |
| 42923.63958333333 | 0.13 |
| 42923.64027777778 | 0.06 |
| 42923.64027777778 | 0.06 |
| 42923.64027777778 | 0.06 |
| 42923.64027777778 | 0.06 |
| 42923.64097222222 | 0.13 |
| 42923.64097222222 | 0.13 |
| 42923.64097222222 | 0.13 |
| 42923.64097222222 | 0.06 |
| 42923.64166666667 | 0.06 |
| 42923.64166666667 | 0.13 |
| 42923.64166666667 | 0.13 |
| 42923.64236111111 | 0.13 |
| 42923.64236111111 | 0.13 |
| 42923.64236111111 | 0.06 |
| 42923.64236111111 | 0.06 |
| 42923.643055555556 | 0.13 |
| 42923.643055555556 | 0.06 |
| 42923.643055555556 | 0.13 |
| 42923.643055555556 | 0.13 |
| 42923.64375 | 0.13 |
| 42923.64375 | 0.13 |
| 42923.64375 | 0.13 |
| 42923.64375 | 0.13 |
| 42923.64444444444 | 0.13 |
| 42923.64444444444 | 0.19 |
| 42923.64444444444 | 0.13 |
| 42923.64444444444 | 0.13 |
| 42923.64513888889 | 0.13 |
| 42923.64513888889 | 0.06 |
| 42923.64513888889 | 0.06 |
| 42923.64513888889 | 0.06 |
| 42923.645833333336 | 0.13 |
| 42923.645833333336 | 0.13 |
| 42923.645833333336 | 0.06 |
| 42923.645833333336 | 0.13 |
| 42923.646527777775 | 0.13 |
| 42923.646527777775 | 0.13 |
| 42923.646527777775 | 0.13 |
| 42923.646527777775 | 0.06 |
| 42923.64722222222 | 0.13 |
| 42923.64722222222 | 0.06 |
| 42923.64722222222 | 0.13 |
| 42923.64722222222 | 0.06 |
| 42923.64791666667 | 0.06 |
| 42923.64791666667 | 0.06 |
| 42923.64791666667 | 0.06 |
| 42923.64861111111 | 0.13 |
| 42923.64861111111 | 0.06 |
| 42923.64861111111 | 0.13 |
| 42923.64861111111 | 0.13 |
| 42923.649305555555 | 0.06 |
| 42923.649305555555 | 0.06 |
| 42923.649305555555 | 0.06 |
| 42923.649305555555 | 0 |
| 42923.65 | 0.06 |